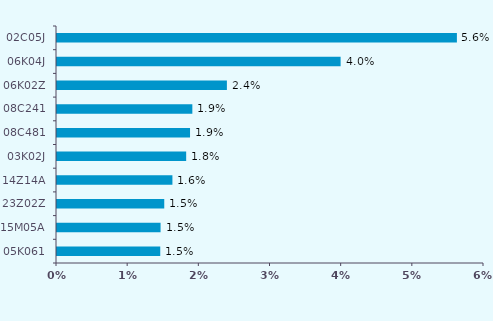
| Category | Series 0 |
|---|---|
| 05K061 | 0.015 |
| 15M05A | 0.015 |
| 23Z02Z | 0.015 |
| 14Z14A | 0.016 |
| 03K02J | 0.018 |
| 08C481 | 0.019 |
| 08C241 | 0.019 |
| 06K02Z | 0.024 |
| 06K04J | 0.04 |
| 02C05J | 0.056 |